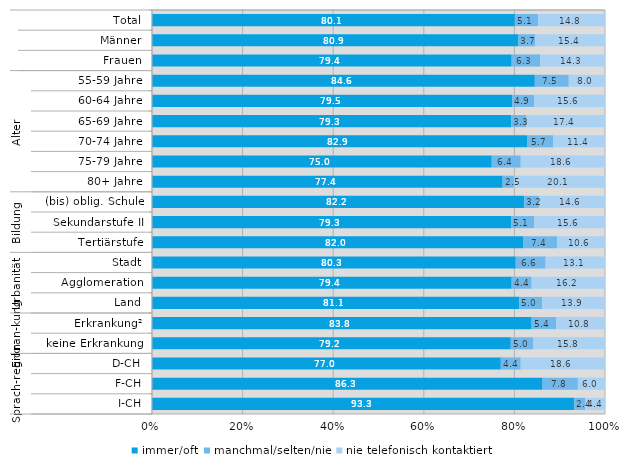
| Category | immer/oft | manchmal/selten/nie | nie telefonisch kontaktiert |
|---|---|---|---|
| 0 | 80.1 | 5.1 | 14.8 |
| 1 | 80.9 | 3.7 | 15.4 |
| 2 | 79.4 | 6.3 | 14.3 |
| 3 | 84.6 | 7.5 | 8 |
| 4 | 79.5 | 4.9 | 15.6 |
| 5 | 79.3 | 3.3 | 17.4 |
| 6 | 82.9 | 5.7 | 11.4 |
| 7 | 75 | 6.4 | 18.6 |
| 8 | 77.4 | 2.5 | 20.1 |
| 9 | 82.2 | 3.2 | 14.6 |
| 10 | 79.3 | 5.1 | 15.6 |
| 11 | 82 | 7.4 | 10.6 |
| 12 | 80.3 | 6.6 | 13.1 |
| 13 | 79.4 | 4.4 | 16.2 |
| 14 | 81.1 | 5 | 13.9 |
| 15 | 83.8 | 5.4 | 10.8 |
| 16 | 79.2 | 5 | 15.8 |
| 17 | 77 | 4.4 | 18.6 |
| 18 | 86.3 | 7.8 | 6 |
| 19 | 93.3 | 2.4 | 4.4 |